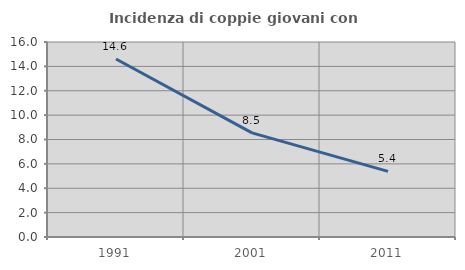
| Category | Incidenza di coppie giovani con figli |
|---|---|
| 1991.0 | 14.602 |
| 2001.0 | 8.545 |
| 2011.0 | 5.385 |